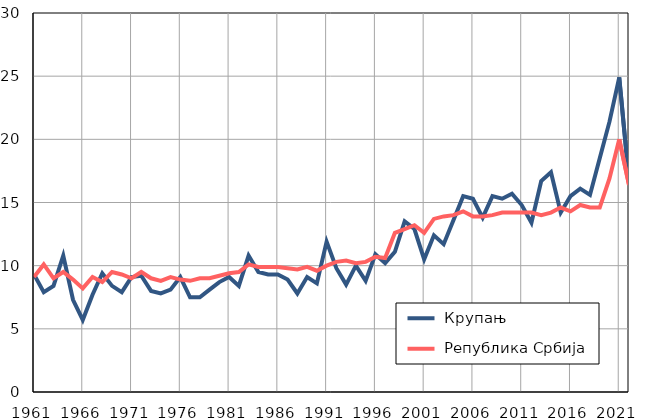
| Category |  Крупањ |  Република Србија |
|---|---|---|
| 1961.0 | 9.3 | 9.1 |
| 1962.0 | 7.9 | 10.1 |
| 1963.0 | 8.4 | 9 |
| 1964.0 | 10.8 | 9.5 |
| 1965.0 | 7.3 | 8.9 |
| 1966.0 | 5.7 | 8.2 |
| 1967.0 | 7.7 | 9.1 |
| 1968.0 | 9.4 | 8.7 |
| 1969.0 | 8.4 | 9.5 |
| 1970.0 | 7.9 | 9.3 |
| 1971.0 | 9.1 | 9 |
| 1972.0 | 9.2 | 9.5 |
| 1973.0 | 8 | 9 |
| 1974.0 | 7.8 | 8.8 |
| 1975.0 | 8.1 | 9.1 |
| 1976.0 | 9.1 | 8.9 |
| 1977.0 | 7.5 | 8.8 |
| 1978.0 | 7.5 | 9 |
| 1979.0 | 8.1 | 9 |
| 1980.0 | 8.7 | 9.2 |
| 1981.0 | 9.1 | 9.4 |
| 1982.0 | 8.4 | 9.5 |
| 1983.0 | 10.8 | 10.1 |
| 1984.0 | 9.5 | 9.9 |
| 1985.0 | 9.3 | 9.9 |
| 1986.0 | 9.3 | 9.9 |
| 1987.0 | 8.9 | 9.8 |
| 1988.0 | 7.8 | 9.7 |
| 1989.0 | 9.1 | 9.9 |
| 1990.0 | 8.6 | 9.6 |
| 1991.0 | 11.9 | 10 |
| 1992.0 | 9.8 | 10.3 |
| 1993.0 | 8.5 | 10.4 |
| 1994.0 | 10 | 10.2 |
| 1995.0 | 8.8 | 10.3 |
| 1996.0 | 10.9 | 10.7 |
| 1997.0 | 10.2 | 10.6 |
| 1998.0 | 11.1 | 12.6 |
| 1999.0 | 13.5 | 12.9 |
| 2000.0 | 12.9 | 13.2 |
| 2001.0 | 10.5 | 12.6 |
| 2002.0 | 12.4 | 13.7 |
| 2003.0 | 11.7 | 13.9 |
| 2004.0 | 13.6 | 14 |
| 2005.0 | 15.5 | 14.3 |
| 2006.0 | 15.3 | 13.9 |
| 2007.0 | 13.8 | 13.9 |
| 2008.0 | 15.5 | 14 |
| 2009.0 | 15.3 | 14.2 |
| 2010.0 | 15.7 | 14.2 |
| 2011.0 | 14.8 | 14.2 |
| 2012.0 | 13.4 | 14.2 |
| 2013.0 | 16.7 | 14 |
| 2014.0 | 17.4 | 14.2 |
| 2015.0 | 14.2 | 14.6 |
| 2016.0 | 15.5 | 14.3 |
| 2017.0 | 16.1 | 14.8 |
| 2018.0 | 15.6 | 14.6 |
| 2019.0 | 18.5 | 14.6 |
| 2020.0 | 21.4 | 16.9 |
| 2021.0 | 24.9 | 20 |
| 2022.0 | 16.7 | 16.4 |